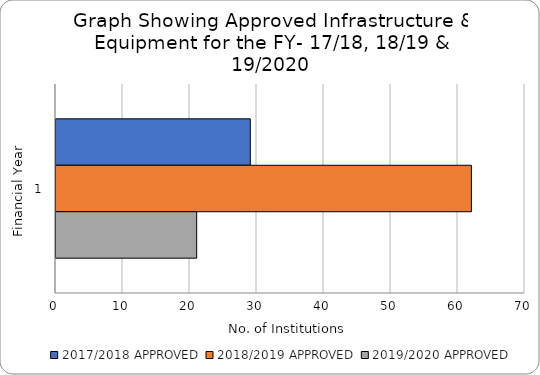
| Category | 2017/2018 APPROVED | 2018/2019 APPROVED | 2019/2020 APPROVED |
|---|---|---|---|
| 0 | 29 | 62 | 21 |